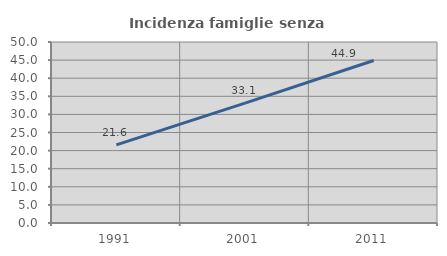
| Category | Incidenza famiglie senza nuclei |
|---|---|
| 1991.0 | 21.569 |
| 2001.0 | 33.1 |
| 2011.0 | 44.888 |